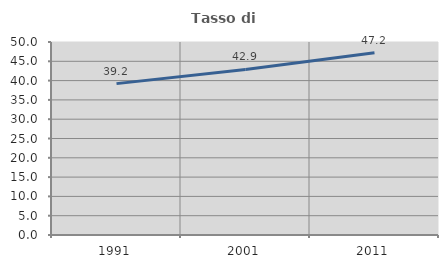
| Category | Tasso di occupazione   |
|---|---|
| 1991.0 | 39.216 |
| 2001.0 | 42.9 |
| 2011.0 | 47.186 |